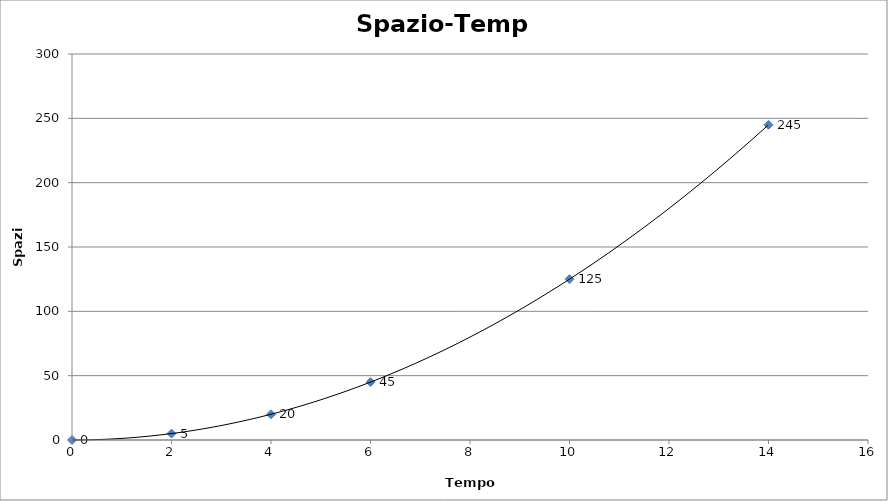
| Category | s |
|---|---|
| 0.0 | 0 |
| 2.0 | 5 |
| 4.0 | 20 |
| 6.0 | 45 |
| 10.0 | 125 |
| 14.0 | 245 |